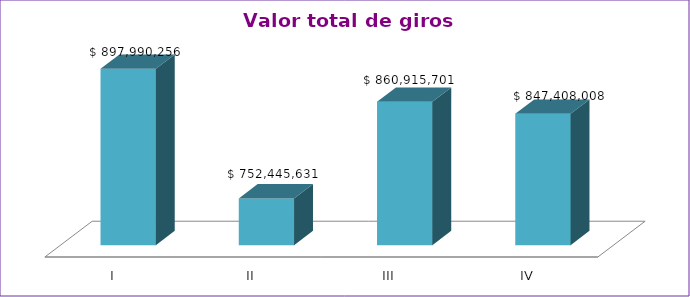
| Category | Series 0 |
|---|---|
| I | 897990256 |
| II | 752445631 |
| III | 860915701 |
| IV | 847408008 |